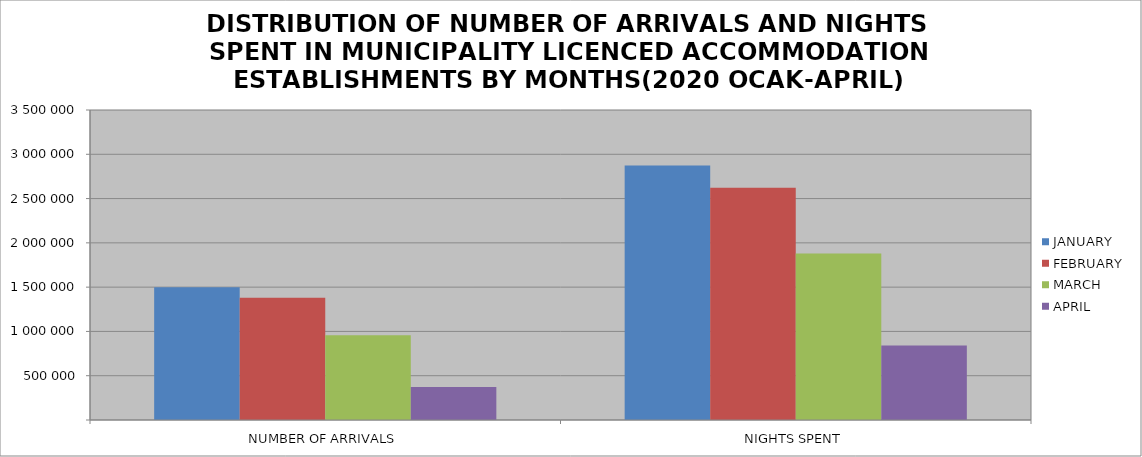
| Category | JANUARY | FEBRUARY | MARCH | APRIL |
|---|---|---|---|---|
| NUMBER OF ARRIVALS | 1497815 | 1380765 | 955554 | 372466 |
| NIGHTS SPENT | 2872303 | 2621819 | 1878971 | 839735 |